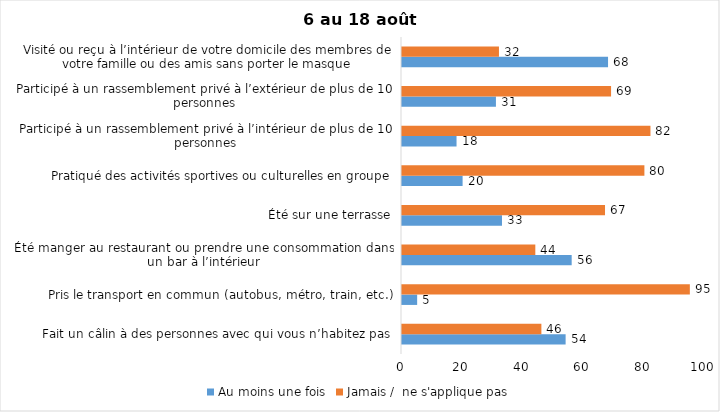
| Category | Au moins une fois | Jamais /  ne s'applique pas |
|---|---|---|
| Fait un câlin à des personnes avec qui vous n’habitez pas | 54 | 46 |
| Pris le transport en commun (autobus, métro, train, etc.) | 5 | 95 |
| Été manger au restaurant ou prendre une consommation dans un bar à l’intérieur | 56 | 44 |
| Été sur une terrasse | 33 | 67 |
| Pratiqué des activités sportives ou culturelles en groupe | 20 | 80 |
| Participé à un rassemblement privé à l’intérieur de plus de 10 personnes | 18 | 82 |
| Participé à un rassemblement privé à l’extérieur de plus de 10 personnes | 31 | 69 |
| Visité ou reçu à l’intérieur de votre domicile des membres de votre famille ou des amis sans porter le masque | 68 | 32 |